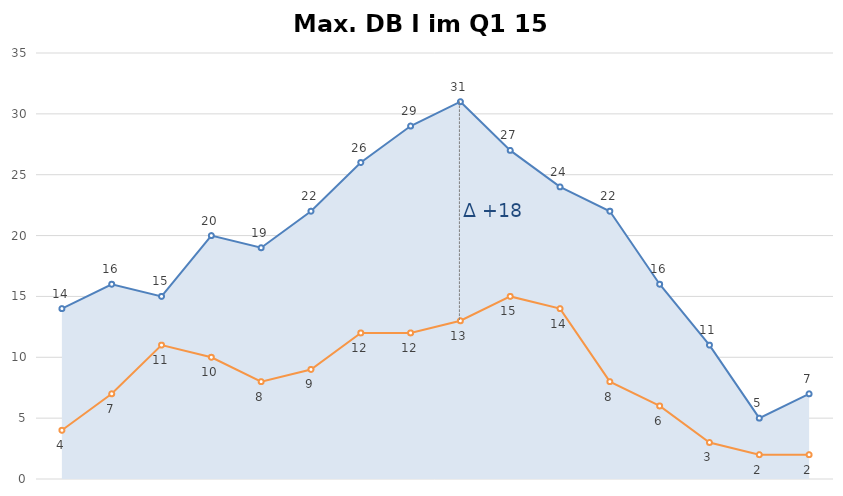
| Category | Umsatz | Kosten |
|---|---|---|
| Q1 13 | 14 | 4 |
| Q2 13 | 16 | 7 |
| Q3 13 | 15 | 11 |
| Q4 13 | 20 | 10 |
| Q1 14 | 19 | 8 |
| Q2 14 | 22 | 9 |
| Q3 14 | 26 | 12 |
| Q4 14 | 29 | 12 |
| Q1 15 | 31 | 13 |
| Q2 15 | 27 | 15 |
| Q3 15 | 24 | 14 |
| Q4 15 | 22 | 8 |
| Q1 16 | 16 | 6 |
| Q2 16 | 11 | 3 |
| Q3 16 | 5 | 2 |
| Q4 16 | 7 | 2 |